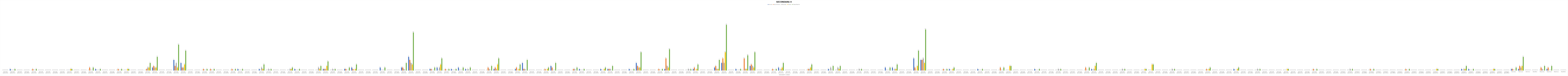
| Category | Ancona | Ascoli Piceno | Macerata | Pesaro | Totale Marche |
|---|---|---|---|---|---|
| 0 | 0 | 0 | 0 | 0 | 0 |
| 1 | 1 | 0 | 0 | 0 | 1 |
| 2 | 0 | 0 | 0 | 0 | 0 |
| 3 | 0 | 0 | 0 | 0 | 0 |
| 4 | 0 | 1 | 0 | 0 | 1 |
| 5 | 0 | 0 | 0 | 0 | 0 |
| 6 | 0 | 0 | 0 | 0 | 0 |
| 7 | 0 | 0 | 0 | 0 | 0 |
| 8 | 0 | 0 | 0 | 0 | 0 |
| 9 | 0 | 0 | 0 | 1 | 1 |
| 10 | 0 | 0 | 0 | 0 | 0 |
| 11 | 0 | 0 | 0 | 0 | 0 |
| 12 | 0 | 2 | 0 | 0 | 2 |
| 13 | 1 | 0 | 0 | 0 | 1 |
| 14 | 0 | 0 | 0 | 0 | 0 |
| 15 | 0 | 0 | 0 | 0 | 0 |
| 16 | 0 | 1 | 0 | 0 | 1 |
| 17 | 0 | 0 | 0 | 1 | 1 |
| 18 | 0 | 0 | 0 | 0 | 0 |
| 19 | 0 | 0 | 0 | 0 | 0 |
| 20 | 0 | 1 | 2 | 2 | 5 |
| 21 | 2 | 3 | 2 | 2 | 9 |
| 22 | 0 | 0 | 0 | 0 | 0 |
| 23 | 0 | 0 | 0 | 0 | 0 |
| 24 | 7 | 3 | 5 | 2 | 17 |
| 25 | 5 | 2 | 2 | 4 | 13 |
| 26 | 0 | 0 | 0 | 0 | 0 |
| 27 | 0 | 0 | 0 | 0 | 0 |
| 28 | 0 | 1 | 0 | 0 | 1 |
| 29 | 0 | 1 | 0 | 0 | 1 |
| 30 | 0 | 0 | 0 | 0 | 0 |
| 31 | 0 | 0 | 0 | 0 | 0 |
| 32 | 0 | 1 | 0 | 0 | 1 |
| 33 | 1 | 0 | 0 | 0 | 1 |
| 34 | 0 | 0 | 0 | 0 | 0 |
| 35 | 0 | 0 | 0 | 0 | 0 |
| 36 | 1 | 0 | 2 | 1 | 4 |
| 37 | 0 | 0 | 1 | 0 | 1 |
| 38 | 0 | 0 | 0 | 0 | 0 |
| 39 | 0 | 0 | 0 | 0 | 0 |
| 40 | 0 | 0 | 1 | 1 | 2 |
| 41 | 1 | 0 | 0 | 0 | 1 |
| 42 | 0 | 0 | 0 | 0 | 0 |
| 43 | 0 | 0 | 0 | 0 | 0 |
| 44 | 0 | 0 | 2 | 1 | 3 |
| 45 | 1 | 1 | 1 | 3 | 6 |
| 46 | 0 | 0 | 1 | 0 | 1 |
| 47 | 0 | 0 | 0 | 0 | 0 |
| 48 | 1 | 1 | 0 | 0 | 2 |
| 49 | 2 | 1 | 0 | 1 | 4 |
| 50 | 0 | 0 | 0 | 0 | 0 |
| 51 | 0 | 0 | 0 | 0 | 0 |
| 52 | 0 | 0 | 0 | 0 | 0 |
| 53 | 2 | 0 | 0 | 0 | 2 |
| 54 | 0 | 0 | 0 | 0 | 0 |
| 55 | 0 | 0 | 0 | 0 | 0 |
| 56 | 2 | 2 | 1 | 0 | 5 |
| 57 | 9 | 7 | 5 | 4 | 25 |
| 58 | 0 | 0 | 0 | 0 | 0 |
| 59 | 0 | 0 | 0 | 0 | 0 |
| 60 | 1 | 1 | 0 | 0 | 2 |
| 61 | 2 | 0 | 2 | 4 | 8 |
| 62 | 0 | 1 | 0 | 0 | 1 |
| 63 | 1 | 0 | 0 | 0 | 1 |
| 64 | 2 | 0 | 0 | 0 | 2 |
| 65 | 1 | 0 | 1 | 0 | 2 |
| 66 | 0 | 0 | 0 | 0 | 0 |
| 67 | 0 | 0 | 0 | 0 | 0 |
| 68 | 0 | 2 | 1 | 0 | 3 |
| 69 | 1 | 2 | 1 | 4 | 8 |
| 70 | 0 | 0 | 0 | 0 | 0 |
| 71 | 0 | 0 | 0 | 0 | 0 |
| 72 | 1 | 2 | 0 | 1 | 4 |
| 73 | 5 | 1 | 1 | 0 | 7 |
| 74 | 0 | 0 | 0 | 0 | 0 |
| 75 | 0 | 0 | 0 | 0 | 0 |
| 76 | 0 | 1 | 0 | 1 | 2 |
| 77 | 3 | 2 | 0 | 0 | 5 |
| 78 | 0 | 0 | 0 | 0 | 0 |
| 79 | 0 | 0 | 0 | 0 | 0 |
| 80 | 0 | 1 | 1 | 0 | 2 |
| 81 | 1 | 0 | 0 | 0 | 1 |
| 82 | 0 | 0 | 0 | 0 | 0 |
| 83 | 0 | 0 | 0 | 0 | 0 |
| 84 | 1 | 0 | 0 | 1 | 2 |
| 85 | 1 | 1 | 1 | 0 | 3 |
| 86 | 0 | 0 | 0 | 0 | 0 |
| 87 | 0 | 0 | 0 | 0 | 0 |
| 88 | 1 | 0 | 0 | 0 | 1 |
| 89 | 5 | 3 | 2 | 2 | 12 |
| 90 | 0 | 0 | 0 | 0 | 0 |
| 91 | 0 | 0 | 0 | 0 | 0 |
| 92 | 0 | 1 | 0 | 0 | 1 |
| 93 | 1 | 8 | 3 | 2 | 14 |
| 94 | 0 | 0 | 0 | 0 | 0 |
| 95 | 0 | 0 | 0 | 0 | 0 |
| 96 | 0 | 0 | 1 | 0 | 1 |
| 97 | 1 | 2 | 0 | 1 | 4 |
| 98 | 0 | 0 | 0 | 0 | 0 |
| 99 | 0 | 0 | 0 | 0 | 0 |
| 100 | 2 | 3 | 1 | 1 | 7 |
| 101 | 5 | 8 | 5 | 12 | 30 |
| 102 | 0 | 0 | 0 | 0 | 0 |
| 103 | 1 | 0 | 0 | 0 | 1 |
| 104 | 0 | 8 | 1 | 1 | 10 |
| 105 | 3 | 4 | 3 | 2 | 12 |
| 106 | 0 | 0 | 0 | 0 | 0 |
| 107 | 0 | 0 | 0 | 0 | 0 |
| 108 | 0 | 1 | 0 | 0 | 1 |
| 109 | 2 | 0 | 1 | 2 | 5 |
| 110 | 0 | 0 | 0 | 0 | 0 |
| 111 | 0 | 0 | 0 | 0 | 0 |
| 112 | 0 | 0 | 0 | 0 | 0 |
| 113 | 0 | 1 | 1 | 2 | 4 |
| 114 | 0 | 0 | 0 | 0 | 0 |
| 115 | 0 | 0 | 0 | 0 | 0 |
| 116 | 1 | 0 | 2 | 0 | 3 |
| 117 | 0 | 0 | 2 | 1 | 3 |
| 118 | 0 | 0 | 0 | 0 | 0 |
| 119 | 0 | 0 | 0 | 0 | 0 |
| 120 | 0 | 0 | 1 | 0 | 1 |
| 121 | 0 | 0 | 0 | 0 | 0 |
| 122 | 0 | 0 | 0 | 0 | 0 |
| 123 | 0 | 0 | 0 | 0 | 0 |
| 124 | 2 | 0 | 0 | 0 | 2 |
| 125 | 2 | 0 | 1 | 1 | 4 |
| 126 | 0 | 0 | 0 | 0 | 0 |
| 127 | 0 | 0 | 0 | 0 | 0 |
| 128 | 8 | 2 | 0 | 3 | 13 |
| 129 | 7 | 7 | 8 | 5 | 27 |
| 130 | 0 | 0 | 0 | 0 | 0 |
| 131 | 0 | 0 | 0 | 0 | 0 |
| 132 | 0 | 1 | 0 | 0 | 1 |
| 133 | 1 | 0 | 0 | 1 | 2 |
| 134 | 0 | 0 | 0 | 0 | 0 |
| 135 | 0 | 0 | 0 | 0 | 0 |
| 136 | 0 | 0 | 0 | 0 | 0 |
| 137 | 1 | 0 | 0 | 0 | 1 |
| 138 | 0 | 0 | 0 | 0 | 0 |
| 139 | 0 | 0 | 0 | 0 | 0 |
| 140 | 0 | 2 | 0 | 0 | 2 |
| 141 | 0 | 0 | 0 | 3 | 3 |
| 142 | 0 | 0 | 0 | 0 | 0 |
| 143 | 0 | 0 | 0 | 0 | 0 |
| 144 | 0 | 0 | 0 | 0 | 0 |
| 145 | 1 | 0 | 0 | 0 | 1 |
| 146 | 0 | 0 | 0 | 0 | 0 |
| 147 | 0 | 0 | 0 | 0 | 0 |
| 148 | 0 | 0 | 1 | 0 | 1 |
| 149 | 0 | 0 | 0 | 0 | 0 |
| 150 | 0 | 0 | 0 | 0 | 0 |
| 151 | 0 | 0 | 0 | 0 | 0 |
| 152 | 0 | 2 | 0 | 0 | 2 |
| 153 | 1 | 0 | 1 | 3 | 5 |
| 154 | 0 | 0 | 0 | 0 | 0 |
| 155 | 0 | 0 | 0 | 0 | 0 |
| 156 | 0 | 0 | 0 | 0 | 0 |
| 157 | 0 | 0 | 1 | 0 | 1 |
| 158 | 0 | 0 | 0 | 0 | 0 |
| 159 | 0 | 0 | 0 | 0 | 0 |
| 160 | 0 | 0 | 0 | 1 | 1 |
| 161 | 0 | 0 | 0 | 4 | 4 |
| 162 | 0 | 0 | 0 | 0 | 0 |
| 163 | 0 | 0 | 0 | 0 | 0 |
| 164 | 0 | 0 | 1 | 0 | 1 |
| 165 | 0 | 0 | 0 | 0 | 0 |
| 166 | 0 | 0 | 0 | 0 | 0 |
| 167 | 0 | 0 | 0 | 0 | 0 |
| 168 | 0 | 0 | 0 | 0 | 0 |
| 169 | 0 | 1 | 0 | 1 | 2 |
| 170 | 0 | 0 | 0 | 0 | 0 |
| 171 | 0 | 0 | 0 | 0 | 0 |
| 172 | 0 | 0 | 0 | 0 | 0 |
| 173 | 1 | 0 | 0 | 1 | 2 |
| 174 | 0 | 0 | 0 | 0 | 0 |
| 175 | 0 | 0 | 0 | 0 | 0 |
| 176 | 0 | 0 | 1 | 0 | 1 |
| 177 | 0 | 0 | 0 | 0 | 0 |
| 178 | 0 | 0 | 0 | 0 | 0 |
| 179 | 0 | 0 | 0 | 0 | 0 |
| 180 | 0 | 0 | 0 | 1 | 1 |
| 181 | 0 | 0 | 0 | 0 | 0 |
| 182 | 0 | 0 | 0 | 0 | 0 |
| 183 | 0 | 0 | 0 | 0 | 0 |
| 184 | 0 | 1 | 0 | 0 | 1 |
| 185 | 0 | 0 | 0 | 0 | 0 |
| 186 | 0 | 0 | 0 | 0 | 0 |
| 187 | 0 | 0 | 0 | 0 | 0 |
| 188 | 0 | 0 | 0 | 0 | 0 |
| 189 | 0 | 0 | 1 | 0 | 1 |
| 190 | 0 | 0 | 0 | 0 | 0 |
| 191 | 0 | 0 | 0 | 0 | 0 |
| 192 | 0 | 1 | 0 | 0 | 1 |
| 193 | 0 | 0 | 0 | 0 | 0 |
| 194 | 0 | 0 | 0 | 0 | 0 |
| 195 | 0 | 0 | 0 | 0 | 0 |
| 196 | 0 | 0 | 0 | 0 | 0 |
| 197 | 0 | 1 | 0 | 0 | 1 |
| 198 | 0 | 0 | 0 | 0 | 0 |
| 199 | 0 | 0 | 0 | 0 | 0 |
| 200 | 0 | 0 | 0 | 0 | 0 |
| 201 | 0 | 0 | 0 | 1 | 1 |
| 202 | 0 | 0 | 0 | 0 | 0 |
| 203 | 0 | 0 | 0 | 0 | 0 |
| 204 | 0 | 0 | 0 | 0 | 0 |
| 205 | 1 | 0 | 1 | 1 | 3 |
| 206 | 1 | 0 | 0 | 0 | 1 |
| 207 | 0 | 0 | 0 | 0 | 0 |
| 208 | 0 | 0 | 0 | 0 | 0 |
| 209 | 0 | 0 | 0 | 1 | 1 |
| 210 | 0 | 0 | 0 | 0 | 0 |
| 211 | 0 | 0 | 0 | 0 | 0 |
| 212 | 1 | 1 | 0 | 0 | 2 |
| 213 | 1 | 3 | 2 | 3 | 9 |
| 214 | 0 | 0 | 0 | 0 | 0 |
| 215 | 0 | 0 | 0 | 0 | 0 |
| 216 | 0 | 2 | 1 | 0 | 3 |
| 217 | 1 | 2 | 0 | 0 | 3 |
| 218 | 0 | 0 | 0 | 0 | 0 |
| 219 | 0 | 0 | 0 | 0 | 0 |